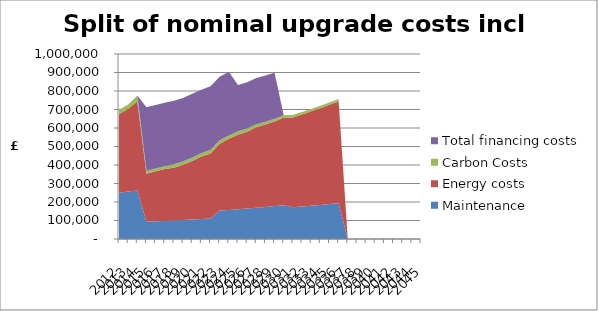
| Category | Maintenance | Energy costs | Carbon Costs | Total financing costs |
|---|---|---|---|---|
| 2012.0 | 249882.068 | 423898.789 | 24621.928 | 0 |
| 2013.0 | 256129.12 | 447472.975 | 24098.057 | 0 |
| 2014.0 | 262532.348 | 482656.619 | 30035.259 | 0 |
| 2015.0 | 93232.86 | 258832.958 | 15773.896 | 343779.299 |
| 2016.0 | 95563.681 | 270186.667 | 15040.226 | 343779.299 |
| 2017.0 | 97952.773 | 280038.981 | 14673.391 | 343779.299 |
| 2018.0 | 100401.593 | 285349.891 | 17883.196 | 343779.299 |
| 2019.0 | 102918.595 | 298553.936 | 16966.109 | 343779.299 |
| 2020.0 | 105491.56 | 316519.739 | 18914.918 | 343779.299 |
| 2021.0 | 108128.849 | 337445.898 | 17768.56 | 343779.299 |
| 2022.0 | 110832.07 | 350826.835 | 20634.456 | 343779.299 |
| 2023.0 | 153442.521 | 361709.98 | 18571.011 | 343779.299 |
| 2024.0 | 157278.584 | 384057.516 | 18571.011 | 343779.299 |
| 2025.0 | 161210.548 | 402466.973 | 18571.011 | 249538.9 |
| 2026.0 | 165240.812 | 414872.595 | 17195.38 | 249538.9 |
| 2027.0 | 169383.291 | 434233.572 | 16507.565 | 249538.9 |
| 2028.0 | 173617.873 | 445387.024 | 15131.935 | 249538.9 |
| 2029.0 | 177958.32 | 457344.943 | 14444.12 | 249538.9 |
| 2030.0 | 182407.278 | 474085.921 | 13068.489 | 0 |
| 2031.0 | 170946.553 | 485970.945 | 13068.489 | 0 |
| 2032.0 | 175220.217 | 498120.218 | 13068.489 | 0 |
| 2033.0 | 179600.722 | 510573.224 | 13068.489 | 0 |
| 2034.0 | 184090.74 | 523337.554 | 13068.489 | 0 |
| 2035.0 | 188705.775 | 536457.284 | 13068.489 | 0 |
| 2036.0 | 193423.419 | 549868.716 | 13068.489 | 0 |
| 2037.0 | 0 | 0 | 0 | 0 |
| 2038.0 | 0 | 0 | 0 | 0 |
| 2039.0 | 0 | 0 | 0 | 0 |
| 2040.0 | 0 | 0 | 0 | 0 |
| 2041.0 | 0 | 0 | 0 | 0 |
| 2042.0 | 0 | 0 | 0 | 0 |
| 2043.0 | 0 | 0 | 0 | 0 |
| 2044.0 | 0 | 0 | 0 | 0 |
| 2045.0 | 0 | 0 | 0 | 0 |